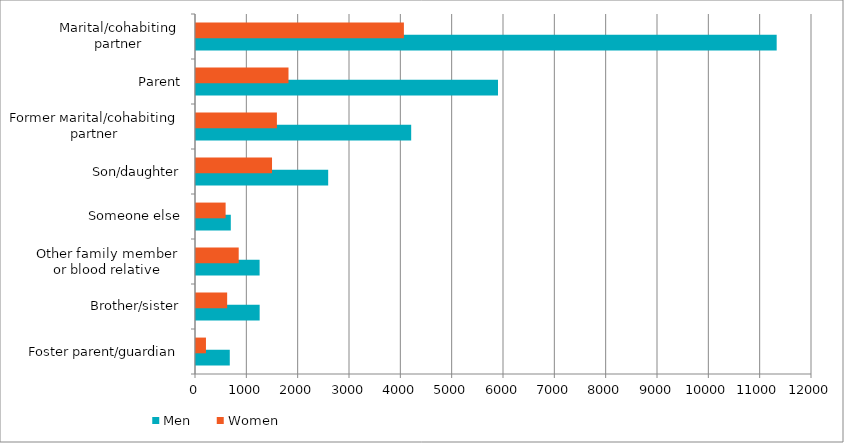
| Category | Men | Women |
|---|---|---|
| Foster parent/guardian | 658 | 194 |
| Brother/sister | 1240 | 607 |
| Other family member
or blood relative | 1239 | 832 |
| Someone else | 678 | 577 |
| Son/daughter | 2575 | 1481 |
| Former мarital/cohabiting
partner | 4192 | 1576 |
| Parent | 5883 | 1802 |
| Marital/cohabiting
partner | 11312 | 4050 |